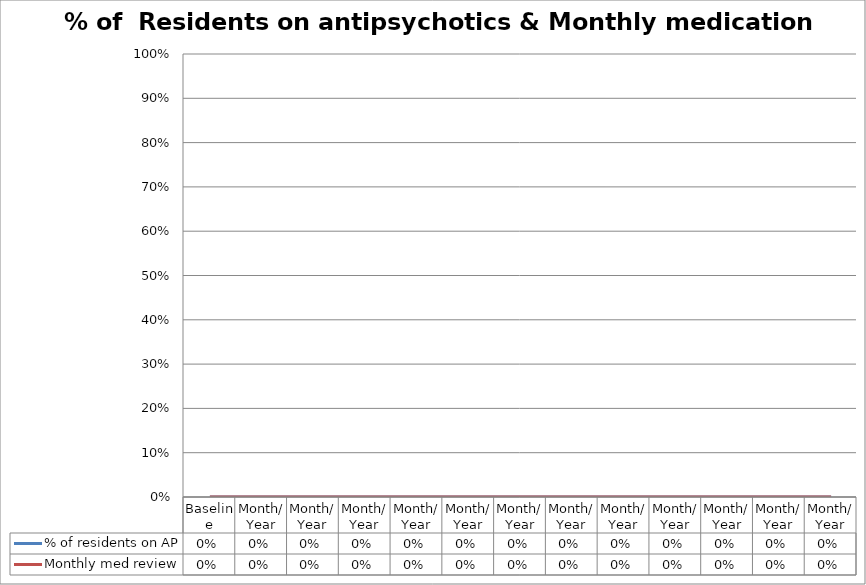
| Category | % of residents on AP | Monthly med review |
|---|---|---|
| Baseline | 0 | 0 |
| Month/Year | 0 | 0 |
| Month/Year | 0 | 0 |
| Month/Year | 0 | 0 |
| Month/Year | 0 | 0 |
| Month/Year | 0 | 0 |
| Month/Year | 0 | 0 |
| Month/Year | 0 | 0 |
| Month/Year | 0 | 0 |
| Month/Year | 0 | 0 |
| Month/Year | 0 | 0 |
| Month/Year | 0 | 0 |
| Month/Year | 0 | 0 |